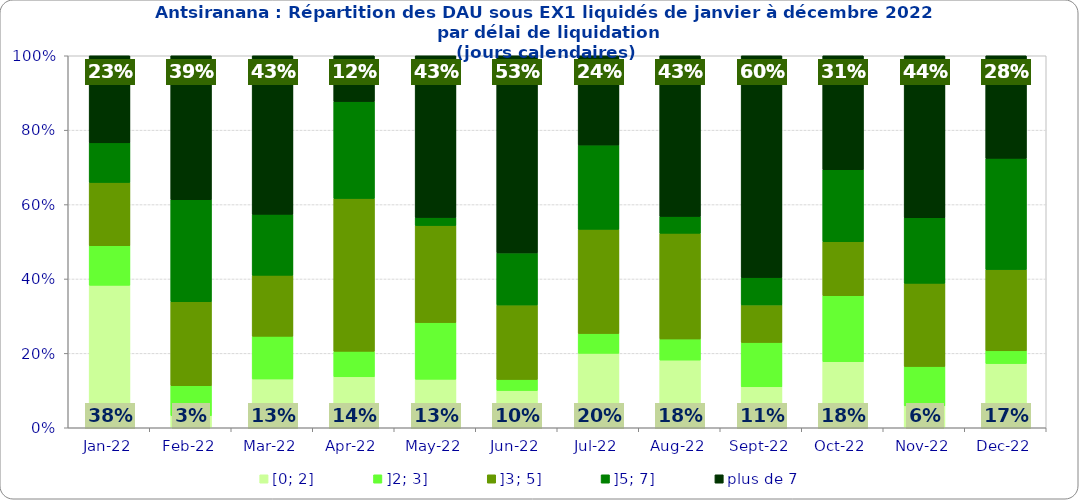
| Category | [0; 2] | ]2; 3] | ]3; 5] | ]5; 7] | plus de 7 |
|---|---|---|---|---|---|
| 2022-01-01 | 0.383 | 0.106 | 0.17 | 0.106 | 0.234 |
| 2022-02-01 | 0.032 | 0.081 | 0.226 | 0.274 | 0.387 |
| 2022-03-01 | 0.131 | 0.115 | 0.164 | 0.164 | 0.426 |
| 2022-04-01 | 0.137 | 0.068 | 0.411 | 0.26 | 0.123 |
| 2022-05-01 | 0.13 | 0.152 | 0.261 | 0.022 | 0.435 |
| 2022-06-01 | 0.1 | 0.03 | 0.2 | 0.14 | 0.53 |
| 2022-07-01 | 0.2 | 0.053 | 0.28 | 0.227 | 0.24 |
| 2022-08-01 | 0.182 | 0.057 | 0.284 | 0.045 | 0.432 |
| 2022-09-01 | 0.11 | 0.119 | 0.101 | 0.073 | 0.596 |
| 2022-10-01 | 0.177 | 0.177 | 0.145 | 0.194 | 0.306 |
| 2022-11-01 | 0.059 | 0.106 | 0.224 | 0.176 | 0.435 |
| 2022-12-01 | 0.172 | 0.034 | 0.218 | 0.299 | 0.276 |